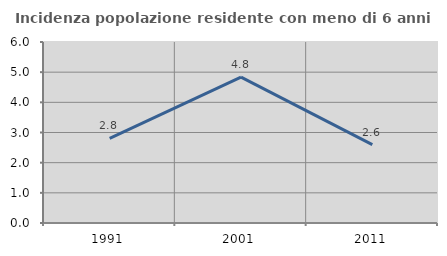
| Category | Incidenza popolazione residente con meno di 6 anni |
|---|---|
| 1991.0 | 2.805 |
| 2001.0 | 4.833 |
| 2011.0 | 2.601 |